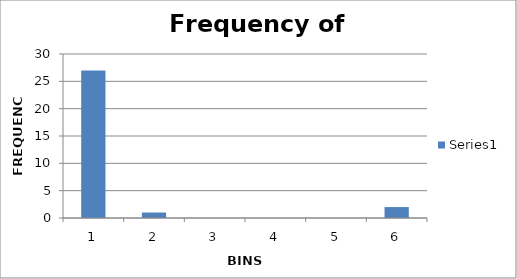
| Category | Series 0 |
|---|---|
| 0 | 27 |
| 1 | 1 |
| 2 | 0 |
| 3 | 0 |
| 4 | 0 |
| 5 | 2 |